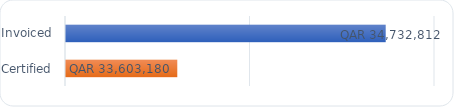
| Category | Cash In |
|---|---|
| Invoiced | 34732811.517 |
| Certified | 33603179.911 |